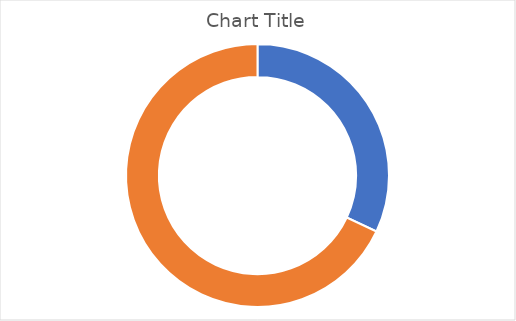
| Category | Series 0 |
|---|---|
| 0 | 0.32 |
| 1 | 0.68 |